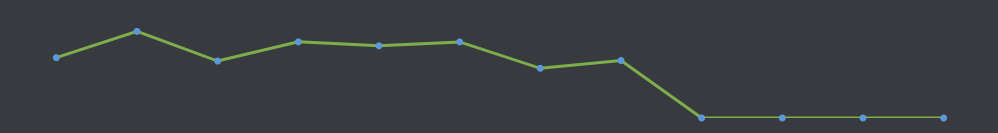
| Category | Қол жетімді қолма қол ақша |
|---|---|
| ҚАҢ | 820 |
| АҚП | 1177 |
| НАУ | 774 |
| СӘУ | 1035 |
| МАМ | 981 |
| МАУ | 1034 |
| ШІЛ | 675 |
| ТАМ | 781 |
| ҚЫР | 0 |
| ҚАЗ | 0 |
| ҚАР | 0 |
| ЖЕЛ | 0 |